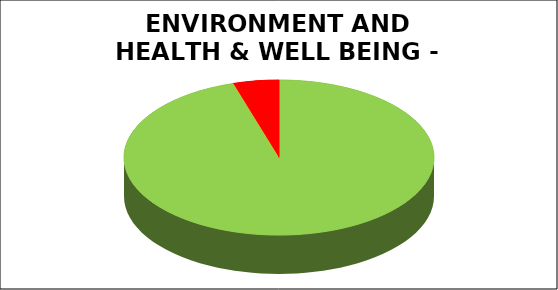
| Category | Series 0 |
|---|---|
| Green | 0.952 |
| Amber | 0 |
| Red | 0.048 |